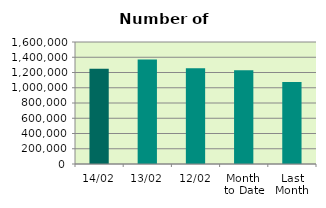
| Category | Series 0 |
|---|---|
| 14/02 | 1249144 |
| 13/02 | 1370450 |
| 12/02 | 1257332 |
| Month 
to Date | 1228029.4 |
| Last
Month | 1075899.909 |